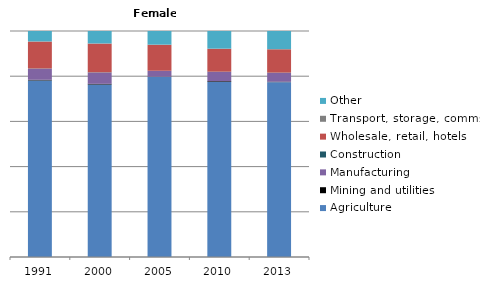
| Category | Agriculture | Mining and utilities | Manufacturing | Construction | Wholesale, retail, hotels | Transport, storage, comms | Other |
|---|---|---|---|---|---|---|---|
| 1991.0 | 78.2 | 0.3 | 4.9 | 0.1 | 11.9 | 0.1 | 4.6 |
| 2000.0 | 76.4 | 0.3 | 5 | 0.1 | 12.7 | 0.1 | 5.5 |
| 2005.0 | 79.7 | 0.1 | 2.6 | 0 | 11.4 | 0.2 | 6 |
| 2010.0 | 77.5 | 0.3 | 4.1 | 0.1 | 10.1 | 0.1 | 7.8 |
| 2013.0 | 77.3 | 0.2 | 3.9 | 0.1 | 10.3 | 0.1 | 8 |